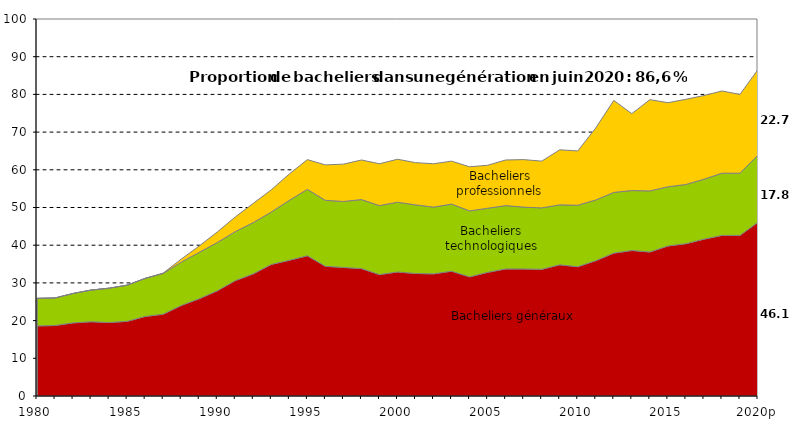
| Category | Bacheliers généraux | Bacheliers technologiques | Bacheliers professionnels |
|---|---|---|---|
| 1980 | 18.6 | 7.3 | 0 |
| 1981 | 18.7 | 7.3 | 0 |
| 1982 | 19.4 | 7.8 | 0 |
| 1983 | 19.7 | 8.4 | 0 |
| 1984 | 19.5 | 9.1 | 0 |
| 1985 | 19.8 | 9.6 | 0 |
| 1986 | 21.1 | 10.1 | 0 |
| 1987 | 21.7 | 10.8 | 0.1 |
| 1988 | 24 | 11.5 | 0.8 |
| 1989 | 25.8 | 12.3 | 1.7 |
| 1990 | 27.9 | 12.8 | 2.8 |
| 1991 | 30.6 | 13 | 3.9 |
| 1992 | 32.4 | 13.6 | 5.1 |
| 1993 | 34.9 | 13.9 | 5.9 |
| 1994 | 36 | 15.9 | 7 |
| 1995 | 37.2 | 17.6 | 7.9 |
| 1996 | 34.4 | 17.5 | 9.4 |
| 1997 | 34.1 | 17.5 | 9.9 |
| 1998 | 33.8 | 18.3 | 10.5 |
| 1999 | 32.2 | 18.3 | 11.1 |
| 2000 | 32.9 | 18.5 | 11.4 |
| 2001 | 32.5 | 18.2 | 11.2 |
| 2002 | 32.4 | 17.7 | 11.5 |
| 2003 | 33.1 | 17.8 | 11.4 |
| 2004 | 31.6 | 17.5 | 11.7 |
| 2005 | 32.8 | 17 | 11.4 |
| 2006 | 33.7 | 16.8 | 12.1 |
| 2007 | 33.7 | 16.4 | 12.6 |
| 2008 | 33.6 | 16.3 | 12.4 |
| 2009 | 34.8 | 15.9 | 14.6 |
| 2010 | 34.3 | 16.3 | 14.4 |
| 2011 | 35.9 | 16.1 | 19.1 |
| 2012 | 37.9 | 16.1 | 24.4 |
| 2013 | 38.6 | 15.9 | 20.4 |
| 2014 | 38.2 | 16.2 | 24.2 |
| 2015 | 39.8 | 15.7 | 22.3 |
| 2016 | 40.4 | 15.7 | 22.6 |
| 2017p | 41.6 | 15.9 | 22.2 |
| 2018p | 42.6 | 16.5 | 21.8 |
| 2019p | 42.6 | 16.5 | 20.9 |
| 2020p | 46.1 | 17.8 | 22.7 |